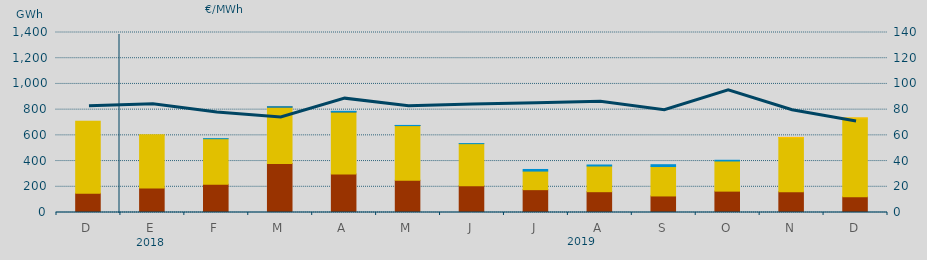
| Category | Carbón | Ciclo Combinado | Consumo Bombeo | Hidráulica | Otras Renovables |
|---|---|---|---|---|---|
| D | 149326 | 561113.3 | 0 | 0 | 0 |
| E | 190959 | 413339.8 | 0 | 0 | 0 |
| F | 219079.1 | 354875.6 | 0 | 360 | 0 |
| M | 380779.9 | 439376.7 | 792 | 709.4 | 0 |
| A | 299645.9 | 482984.6 | 52 | 4315.4 | 0 |
| M | 250250 | 425915 | 190 | 880 | 0 |
| J | 209003 | 326625.6 | 0 | 334.5 | 0 |
| J | 177655 | 144531.3 | 0 | 12515 | 0 |
| A | 161808 | 199805.1 | 0 | 7890 | 0 |
| S | 128712 | 228795.2 | 0 | 14281 | 0 |
| O | 166180 | 234526.2 | 0 | 5517.1 | 0 |
| N | 161365 | 421030.7 | 0 | 0 | 1775.2 |
| D | 122168 | 612250.1 | 0 | 0 | 164.2 |